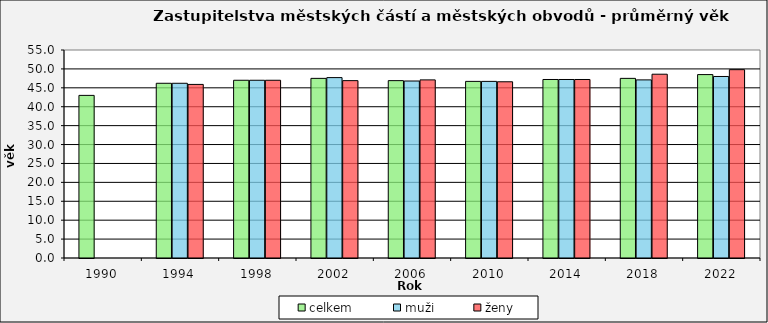
| Category | celkem | muži | ženy |
|---|---|---|---|
| 1990.0 | 43 | 0 | 0 |
| 1994.0 | 46.2 | 46.2 | 45.9 |
| 1998.0 | 47 | 47 | 47 |
| 2002.0 | 47.5 | 47.7 | 46.9 |
| 2006.0 | 46.9 | 46.8 | 47.1 |
| 2010.0 | 46.7 | 46.7 | 46.6 |
| 2014.0 | 47.2 | 47.2 | 47.2 |
| 2018.0 | 47.5 | 47.1 | 48.6 |
| 2022.0 | 48.5 | 48 | 49.8 |